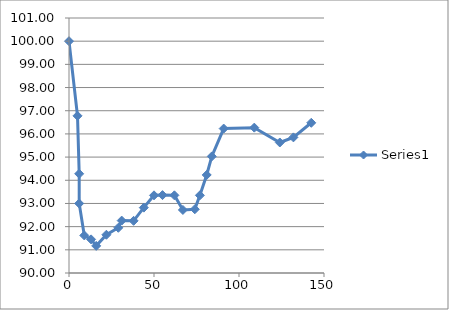
| Category | Series 0 |
|---|---|
| 0.0 | 100 |
| 5.0 | 96.78 |
| 6.0 | 94.28 |
| 6.0 | 93 |
| 9.0 | 91.62 |
| 13.0 | 91.45 |
| 16.0 | 91.17 |
| 22.0 | 91.65 |
| 29.0 | 91.95 |
| 31.0 | 92.26 |
| 38.0 | 92.25 |
| 44.0 | 92.82 |
| 50.0 | 93.35 |
| 55.0 | 93.36 |
| 62.0 | 93.35 |
| 67.0 | 92.72 |
| 74.0 | 92.75 |
| 77.0 | 93.35 |
| 81.0 | 94.23 |
| 84.0 | 95.03 |
| 91.0 | 96.23 |
| 109.0 | 96.27 |
| 124.0 | 95.63 |
| 132.0 | 95.85 |
| 142.5 | 96.48 |